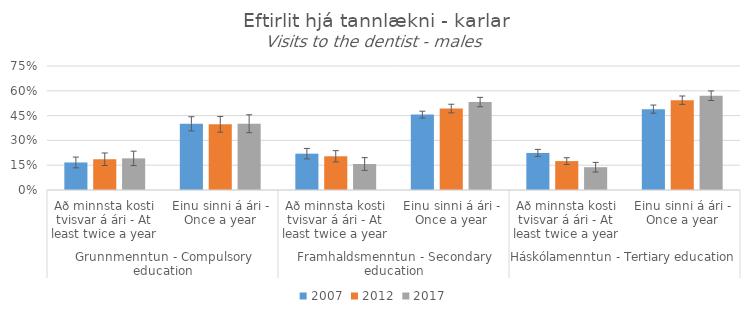
| Category | 2007 | 2012 | 2017 |
|---|---|---|---|
| 0 | 0.167 | 0.186 | 0.191 |
| 1 | 0.4 | 0.397 | 0.401 |
| 2 | 0.22 | 0.204 | 0.157 |
| 3 | 0.456 | 0.493 | 0.532 |
| 4 | 0.224 | 0.175 | 0.138 |
| 5 | 0.489 | 0.543 | 0.57 |